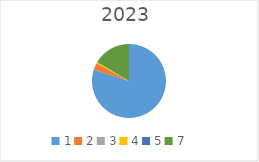
| Category | Series 0 |
|---|---|
| 1.0 | 9719970 |
| 2.0 | 372250 |
| 3.0 | 0 |
| 4.0 | 64688 |
| 5.0 | 0 |
| 7.0 | 2001000 |